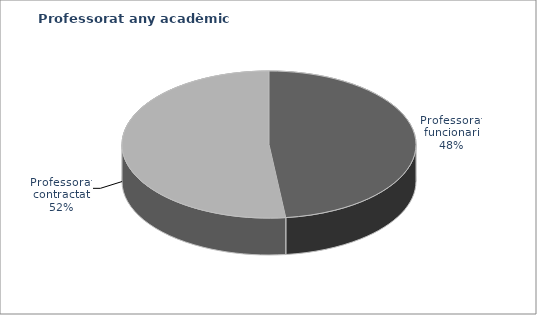
| Category | Series 0 |
|---|---|
| Professorat funcionari | 1326 |
| Professorat contractat | 1426 |